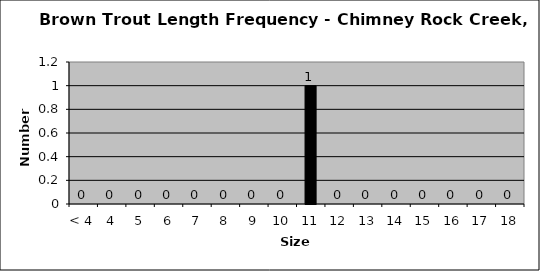
| Category | Series 0 |
|---|---|
| < 4 | 0 |
| 4 | 0 |
| 5 | 0 |
| 6 | 0 |
| 7 | 0 |
| 8 | 0 |
| 9 | 0 |
| 10 | 0 |
| 11 | 1 |
| 12 | 0 |
| 13 | 0 |
| 14 | 0 |
| 15 | 0 |
| 16 | 0 |
| 17 | 0 |
| 18 | 0 |